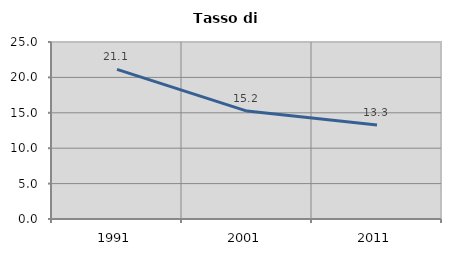
| Category | Tasso di disoccupazione   |
|---|---|
| 1991.0 | 21.138 |
| 2001.0 | 15.241 |
| 2011.0 | 13.283 |